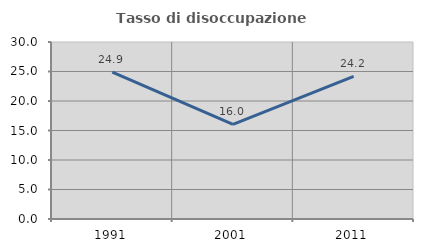
| Category | Tasso di disoccupazione giovanile  |
|---|---|
| 1991.0 | 24.9 |
| 2001.0 | 16.045 |
| 2011.0 | 24.176 |